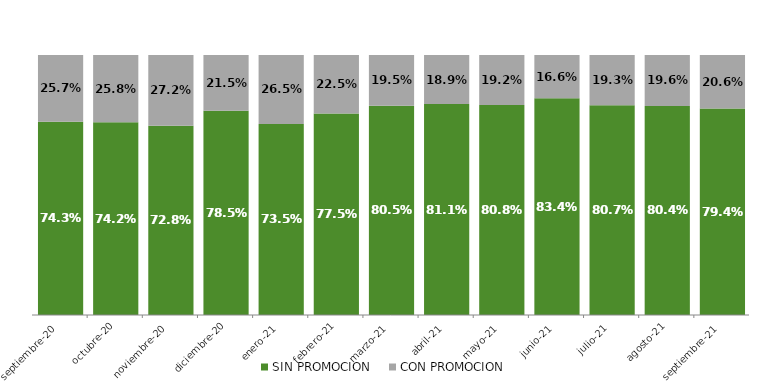
| Category | SIN PROMOCION   | CON PROMOCION   |
|---|---|---|
| 2020-09-01 | 0.743 | 0.257 |
| 2020-10-01 | 0.742 | 0.258 |
| 2020-11-01 | 0.728 | 0.272 |
| 2020-12-01 | 0.785 | 0.215 |
| 2021-01-01 | 0.735 | 0.265 |
| 2021-02-01 | 0.775 | 0.225 |
| 2021-03-01 | 0.805 | 0.195 |
| 2021-04-01 | 0.811 | 0.189 |
| 2021-05-01 | 0.808 | 0.192 |
| 2021-06-01 | 0.834 | 0.166 |
| 2021-07-01 | 0.807 | 0.193 |
| 2021-08-01 | 0.804 | 0.196 |
| 2021-09-01 | 0.794 | 0.206 |